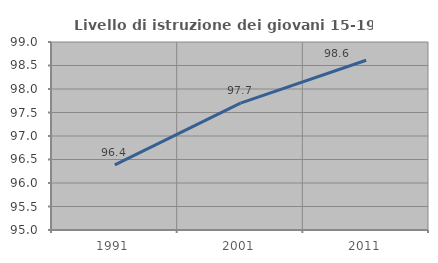
| Category | Livello di istruzione dei giovani 15-19 anni |
|---|---|
| 1991.0 | 96.386 |
| 2001.0 | 97.701 |
| 2011.0 | 98.611 |